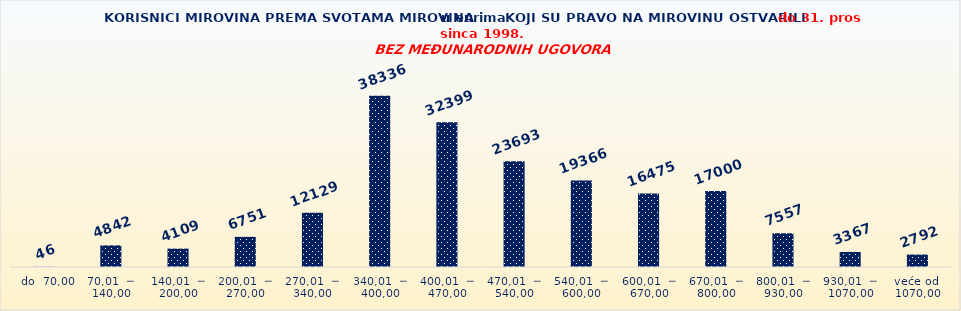
| Category | Series 0 |
|---|---|
|   do  70,00 | 46 |
| 70,01  ─  140,00 | 4842 |
| 140,01  ─  200,00 | 4109 |
| 200,01  ─  270,00 | 6751 |
| 270,01  ─  340,00 | 12129 |
| 340,01  ─  400,00 | 38336 |
| 400,01  ─  470,00 | 32399 |
| 470,01  ─  540,00 | 23693 |
| 540,01  ─  600,00 | 19366 |
| 600,01  ─  670,00 | 16475 |
| 670,01  ─  800,00 | 17000 |
| 800,01  ─  930,00 | 7557 |
| 930,01  ─  1070,00 | 3367 |
| veće od  1070,00 | 2792 |